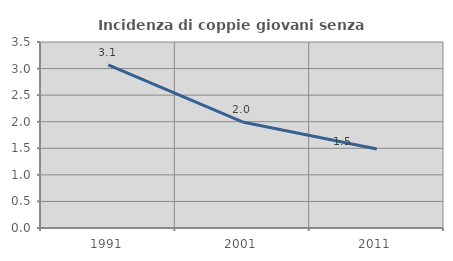
| Category | Incidenza di coppie giovani senza figli |
|---|---|
| 1991.0 | 3.07 |
| 2001.0 | 1.995 |
| 2011.0 | 1.487 |